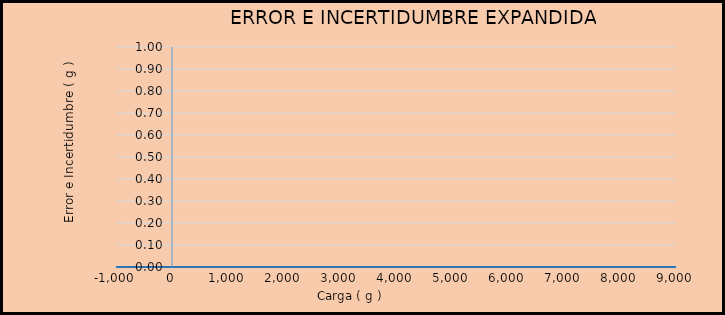
| Category | ERROR (g) |
|---|---|
| 0.0 | 0 |
| 0.0 | 0 |
| 0.0 | 0 |
| 0.0 | 0 |
| 0.0 | 0 |